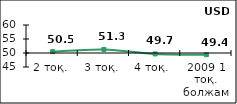
| Category | Диффузионный индекс* |
|---|---|
| 2 тоқ. | 50.48 |
| 3 тоқ. | 51.275 |
| 4 тоқ.  | 49.67 |
| 2009 1 тоқ. болжам | 49.395 |